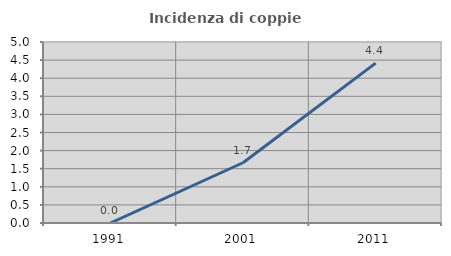
| Category | Incidenza di coppie miste |
|---|---|
| 1991.0 | 0 |
| 2001.0 | 1.664 |
| 2011.0 | 4.418 |